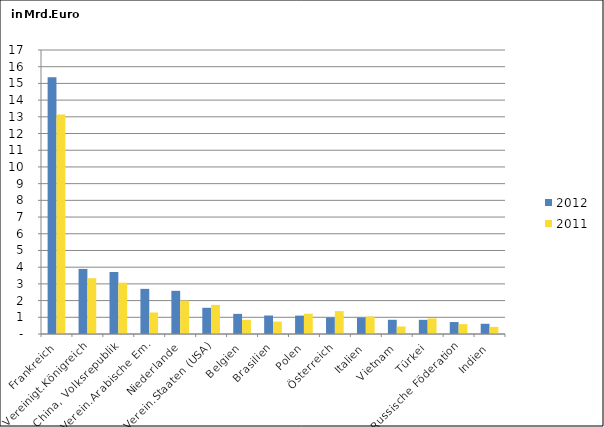
| Category | 2012 | 2011 |
|---|---|---|
| Frankreich | 15.37 | 13.143 |
| Vereinigt.Königreich | 3.895 | 3.341 |
| China, Volksrepublik | 3.71 | 3.074 |
| Verein.Arabische Em. | 2.701 | 1.289 |
| Niederlande | 2.585 | 2.001 |
| Verein.Staaten (USA) | 1.569 | 1.741 |
| Belgien | 1.205 | 0.847 |
| Brasilien | 1.106 | 0.744 |
| Polen | 1.101 | 1.217 |
| Österreich | 0.993 | 1.371 |
| Italien | 0.985 | 1.049 |
| Vietnam | 0.85 | 0.45 |
| Türkei | 0.847 | 0.936 |
| Russische Föderation | 0.715 | 0.591 |
| Indien | 0.611 | 0.429 |